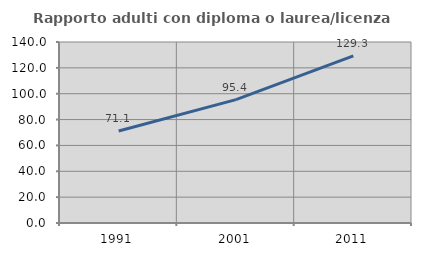
| Category | Rapporto adulti con diploma o laurea/licenza media  |
|---|---|
| 1991.0 | 71.111 |
| 2001.0 | 95.425 |
| 2011.0 | 129.299 |